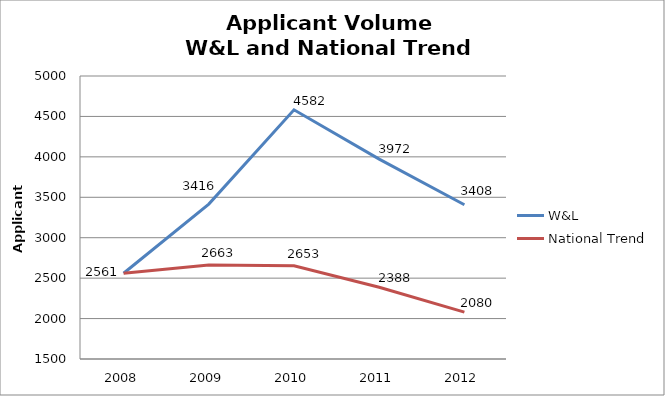
| Category | W&L | National Trend |
|---|---|---|
| 2008.0 | 2561 | 2561 |
| 2009.0 | 3416 | 2663.44 |
| 2010.0 | 4582 | 2652.786 |
| 2011.0 | 3972 | 2387.508 |
| 2012.0 | 3408 | 2079.519 |